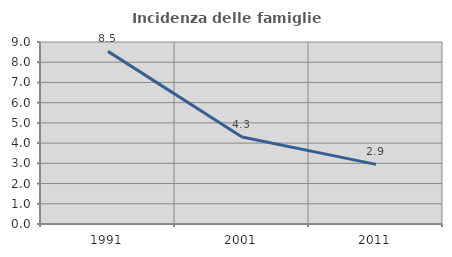
| Category | Incidenza delle famiglie numerose |
|---|---|
| 1991.0 | 8.537 |
| 2001.0 | 4.305 |
| 2011.0 | 2.95 |